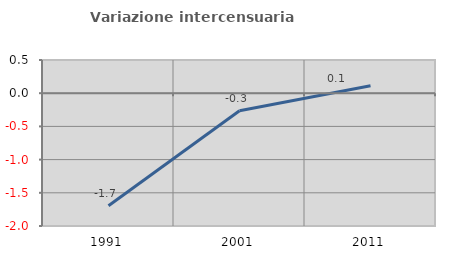
| Category | Variazione intercensuaria annua |
|---|---|
| 1991.0 | -1.696 |
| 2001.0 | -0.263 |
| 2011.0 | 0.111 |